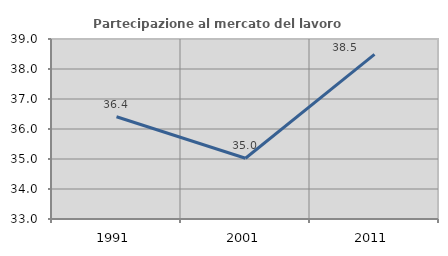
| Category | Partecipazione al mercato del lavoro  femminile |
|---|---|
| 1991.0 | 36.408 |
| 2001.0 | 35.025 |
| 2011.0 | 38.485 |